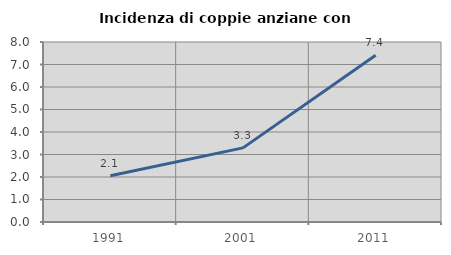
| Category | Incidenza di coppie anziane con figli |
|---|---|
| 1991.0 | 2.057 |
| 2001.0 | 3.294 |
| 2011.0 | 7.407 |